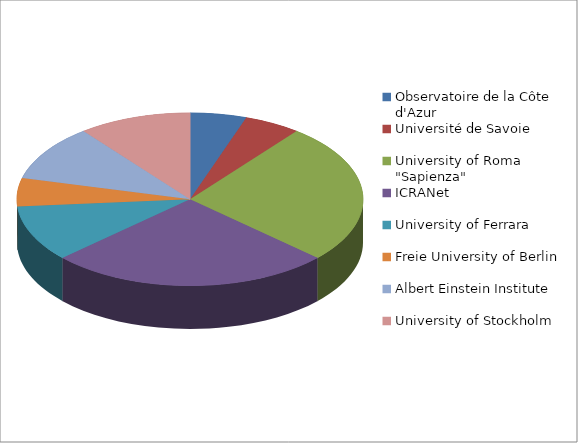
| Category | Series 0 |
|---|---|
| Observatoire de la Côte d'Azur | 1 |
| Université de Savoie | 1 |
| University of Roma "Sapienza" | 5 |
| ICRANet | 5 |
| University of Ferrara | 2 |
| Freie University of Berlin | 1 |
| Albert Einstein Institute | 2 |
| University of Stockholm | 2 |